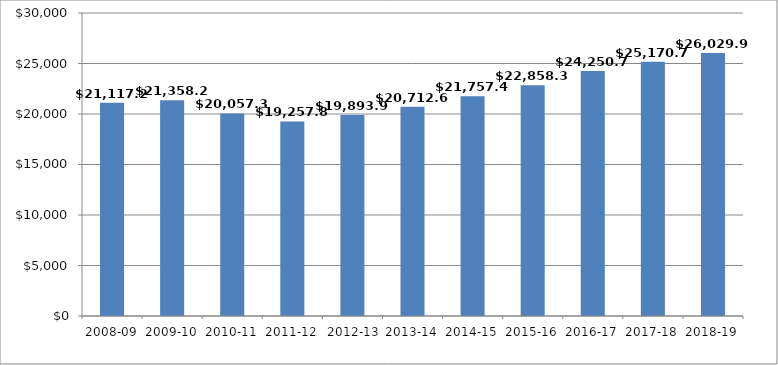
| Category | Series 0 |
|---|---|
| 2008-09 | 21117.209 |
| 2009-10 | 21358.225 |
| 2010-11 | 20057.381 |
| 2011-12 | 19257.842 |
| 2012-13
 | 19893.983 |
| 2013-14 | 20712.681 |
| 2014-15 | 21757.472 |
| 2015-16 | 22858.355 |
| 2016-17 | 24250.757 |
| 2017-18 | 25170.751 |
| 2018-19 | 26029.897 |